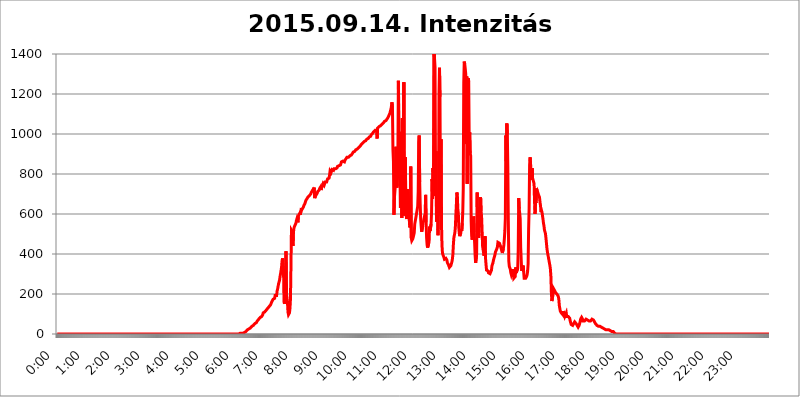
| Category | 2015.09.14. Intenzitás [W/m^2] |
|---|---|
| 0.0 | 0 |
| 0.0006944444444444445 | 0 |
| 0.001388888888888889 | 0 |
| 0.0020833333333333333 | 0 |
| 0.002777777777777778 | 0 |
| 0.003472222222222222 | 0 |
| 0.004166666666666667 | 0 |
| 0.004861111111111111 | 0 |
| 0.005555555555555556 | 0 |
| 0.0062499999999999995 | 0 |
| 0.006944444444444444 | 0 |
| 0.007638888888888889 | 0 |
| 0.008333333333333333 | 0 |
| 0.009027777777777779 | 0 |
| 0.009722222222222222 | 0 |
| 0.010416666666666666 | 0 |
| 0.011111111111111112 | 0 |
| 0.011805555555555555 | 0 |
| 0.012499999999999999 | 0 |
| 0.013194444444444444 | 0 |
| 0.013888888888888888 | 0 |
| 0.014583333333333332 | 0 |
| 0.015277777777777777 | 0 |
| 0.015972222222222224 | 0 |
| 0.016666666666666666 | 0 |
| 0.017361111111111112 | 0 |
| 0.018055555555555557 | 0 |
| 0.01875 | 0 |
| 0.019444444444444445 | 0 |
| 0.02013888888888889 | 0 |
| 0.020833333333333332 | 0 |
| 0.02152777777777778 | 0 |
| 0.022222222222222223 | 0 |
| 0.02291666666666667 | 0 |
| 0.02361111111111111 | 0 |
| 0.024305555555555556 | 0 |
| 0.024999999999999998 | 0 |
| 0.025694444444444447 | 0 |
| 0.02638888888888889 | 0 |
| 0.027083333333333334 | 0 |
| 0.027777777777777776 | 0 |
| 0.02847222222222222 | 0 |
| 0.029166666666666664 | 0 |
| 0.029861111111111113 | 0 |
| 0.030555555555555555 | 0 |
| 0.03125 | 0 |
| 0.03194444444444445 | 0 |
| 0.03263888888888889 | 0 |
| 0.03333333333333333 | 0 |
| 0.034027777777777775 | 0 |
| 0.034722222222222224 | 0 |
| 0.035416666666666666 | 0 |
| 0.036111111111111115 | 0 |
| 0.03680555555555556 | 0 |
| 0.0375 | 0 |
| 0.03819444444444444 | 0 |
| 0.03888888888888889 | 0 |
| 0.03958333333333333 | 0 |
| 0.04027777777777778 | 0 |
| 0.04097222222222222 | 0 |
| 0.041666666666666664 | 0 |
| 0.042361111111111106 | 0 |
| 0.04305555555555556 | 0 |
| 0.043750000000000004 | 0 |
| 0.044444444444444446 | 0 |
| 0.04513888888888889 | 0 |
| 0.04583333333333334 | 0 |
| 0.04652777777777778 | 0 |
| 0.04722222222222222 | 0 |
| 0.04791666666666666 | 0 |
| 0.04861111111111111 | 0 |
| 0.049305555555555554 | 0 |
| 0.049999999999999996 | 0 |
| 0.05069444444444445 | 0 |
| 0.051388888888888894 | 0 |
| 0.052083333333333336 | 0 |
| 0.05277777777777778 | 0 |
| 0.05347222222222222 | 0 |
| 0.05416666666666667 | 0 |
| 0.05486111111111111 | 0 |
| 0.05555555555555555 | 0 |
| 0.05625 | 0 |
| 0.05694444444444444 | 0 |
| 0.057638888888888885 | 0 |
| 0.05833333333333333 | 0 |
| 0.05902777777777778 | 0 |
| 0.059722222222222225 | 0 |
| 0.06041666666666667 | 0 |
| 0.061111111111111116 | 0 |
| 0.06180555555555556 | 0 |
| 0.0625 | 0 |
| 0.06319444444444444 | 0 |
| 0.06388888888888888 | 0 |
| 0.06458333333333334 | 0 |
| 0.06527777777777778 | 0 |
| 0.06597222222222222 | 0 |
| 0.06666666666666667 | 0 |
| 0.06736111111111111 | 0 |
| 0.06805555555555555 | 0 |
| 0.06874999999999999 | 0 |
| 0.06944444444444443 | 0 |
| 0.07013888888888889 | 0 |
| 0.07083333333333333 | 0 |
| 0.07152777777777779 | 0 |
| 0.07222222222222223 | 0 |
| 0.07291666666666667 | 0 |
| 0.07361111111111111 | 0 |
| 0.07430555555555556 | 0 |
| 0.075 | 0 |
| 0.07569444444444444 | 0 |
| 0.0763888888888889 | 0 |
| 0.07708333333333334 | 0 |
| 0.07777777777777778 | 0 |
| 0.07847222222222222 | 0 |
| 0.07916666666666666 | 0 |
| 0.0798611111111111 | 0 |
| 0.08055555555555556 | 0 |
| 0.08125 | 0 |
| 0.08194444444444444 | 0 |
| 0.08263888888888889 | 0 |
| 0.08333333333333333 | 0 |
| 0.08402777777777777 | 0 |
| 0.08472222222222221 | 0 |
| 0.08541666666666665 | 0 |
| 0.08611111111111112 | 0 |
| 0.08680555555555557 | 0 |
| 0.08750000000000001 | 0 |
| 0.08819444444444445 | 0 |
| 0.08888888888888889 | 0 |
| 0.08958333333333333 | 0 |
| 0.09027777777777778 | 0 |
| 0.09097222222222222 | 0 |
| 0.09166666666666667 | 0 |
| 0.09236111111111112 | 0 |
| 0.09305555555555556 | 0 |
| 0.09375 | 0 |
| 0.09444444444444444 | 0 |
| 0.09513888888888888 | 0 |
| 0.09583333333333333 | 0 |
| 0.09652777777777777 | 0 |
| 0.09722222222222222 | 0 |
| 0.09791666666666667 | 0 |
| 0.09861111111111111 | 0 |
| 0.09930555555555555 | 0 |
| 0.09999999999999999 | 0 |
| 0.10069444444444443 | 0 |
| 0.1013888888888889 | 0 |
| 0.10208333333333335 | 0 |
| 0.10277777777777779 | 0 |
| 0.10347222222222223 | 0 |
| 0.10416666666666667 | 0 |
| 0.10486111111111111 | 0 |
| 0.10555555555555556 | 0 |
| 0.10625 | 0 |
| 0.10694444444444444 | 0 |
| 0.1076388888888889 | 0 |
| 0.10833333333333334 | 0 |
| 0.10902777777777778 | 0 |
| 0.10972222222222222 | 0 |
| 0.1111111111111111 | 0 |
| 0.11180555555555556 | 0 |
| 0.11180555555555556 | 0 |
| 0.1125 | 0 |
| 0.11319444444444444 | 0 |
| 0.11388888888888889 | 0 |
| 0.11458333333333333 | 0 |
| 0.11527777777777777 | 0 |
| 0.11597222222222221 | 0 |
| 0.11666666666666665 | 0 |
| 0.1173611111111111 | 0 |
| 0.11805555555555557 | 0 |
| 0.11944444444444445 | 0 |
| 0.12013888888888889 | 0 |
| 0.12083333333333333 | 0 |
| 0.12152777777777778 | 0 |
| 0.12222222222222223 | 0 |
| 0.12291666666666667 | 0 |
| 0.12291666666666667 | 0 |
| 0.12361111111111112 | 0 |
| 0.12430555555555556 | 0 |
| 0.125 | 0 |
| 0.12569444444444444 | 0 |
| 0.12638888888888888 | 0 |
| 0.12708333333333333 | 0 |
| 0.16875 | 0 |
| 0.12847222222222224 | 0 |
| 0.12916666666666668 | 0 |
| 0.12986111111111112 | 0 |
| 0.13055555555555556 | 0 |
| 0.13125 | 0 |
| 0.13194444444444445 | 0 |
| 0.1326388888888889 | 0 |
| 0.13333333333333333 | 0 |
| 0.13402777777777777 | 0 |
| 0.13402777777777777 | 0 |
| 0.13472222222222222 | 0 |
| 0.13541666666666666 | 0 |
| 0.1361111111111111 | 0 |
| 0.13749999999999998 | 0 |
| 0.13819444444444443 | 0 |
| 0.1388888888888889 | 0 |
| 0.13958333333333334 | 0 |
| 0.14027777777777778 | 0 |
| 0.14097222222222222 | 0 |
| 0.14166666666666666 | 0 |
| 0.1423611111111111 | 0 |
| 0.14305555555555557 | 0 |
| 0.14375000000000002 | 0 |
| 0.14444444444444446 | 0 |
| 0.1451388888888889 | 0 |
| 0.1451388888888889 | 0 |
| 0.14652777777777778 | 0 |
| 0.14722222222222223 | 0 |
| 0.14791666666666667 | 0 |
| 0.1486111111111111 | 0 |
| 0.14930555555555555 | 0 |
| 0.15 | 0 |
| 0.15069444444444444 | 0 |
| 0.15138888888888888 | 0 |
| 0.15208333333333332 | 0 |
| 0.15277777777777776 | 0 |
| 0.15347222222222223 | 0 |
| 0.15416666666666667 | 0 |
| 0.15486111111111112 | 0 |
| 0.15555555555555556 | 0 |
| 0.15625 | 0 |
| 0.15694444444444444 | 0 |
| 0.15763888888888888 | 0 |
| 0.15833333333333333 | 0 |
| 0.15902777777777777 | 0 |
| 0.15972222222222224 | 0 |
| 0.16041666666666668 | 0 |
| 0.16111111111111112 | 0 |
| 0.16180555555555556 | 0 |
| 0.1625 | 0 |
| 0.16319444444444445 | 0 |
| 0.1638888888888889 | 0 |
| 0.16458333333333333 | 0 |
| 0.16527777777777777 | 0 |
| 0.16597222222222222 | 0 |
| 0.16666666666666666 | 0 |
| 0.1673611111111111 | 0 |
| 0.16805555555555554 | 0 |
| 0.16874999999999998 | 0 |
| 0.16944444444444443 | 0 |
| 0.17013888888888887 | 0 |
| 0.1708333333333333 | 0 |
| 0.17152777777777775 | 0 |
| 0.17222222222222225 | 0 |
| 0.1729166666666667 | 0 |
| 0.17361111111111113 | 0 |
| 0.17430555555555557 | 0 |
| 0.17500000000000002 | 0 |
| 0.17569444444444446 | 0 |
| 0.1763888888888889 | 0 |
| 0.17708333333333334 | 0 |
| 0.17777777777777778 | 0 |
| 0.17847222222222223 | 0 |
| 0.17916666666666667 | 0 |
| 0.1798611111111111 | 0 |
| 0.18055555555555555 | 0 |
| 0.18125 | 0 |
| 0.18194444444444444 | 0 |
| 0.1826388888888889 | 0 |
| 0.18333333333333335 | 0 |
| 0.1840277777777778 | 0 |
| 0.18472222222222223 | 0 |
| 0.18541666666666667 | 0 |
| 0.18611111111111112 | 0 |
| 0.18680555555555556 | 0 |
| 0.1875 | 0 |
| 0.18819444444444444 | 0 |
| 0.18888888888888888 | 0 |
| 0.18958333333333333 | 0 |
| 0.19027777777777777 | 0 |
| 0.1909722222222222 | 0 |
| 0.19166666666666665 | 0 |
| 0.19236111111111112 | 0 |
| 0.19305555555555554 | 0 |
| 0.19375 | 0 |
| 0.19444444444444445 | 0 |
| 0.1951388888888889 | 0 |
| 0.19583333333333333 | 0 |
| 0.19652777777777777 | 0 |
| 0.19722222222222222 | 0 |
| 0.19791666666666666 | 0 |
| 0.1986111111111111 | 0 |
| 0.19930555555555554 | 0 |
| 0.19999999999999998 | 0 |
| 0.20069444444444443 | 0 |
| 0.20138888888888887 | 0 |
| 0.2020833333333333 | 0 |
| 0.2027777777777778 | 0 |
| 0.2034722222222222 | 0 |
| 0.2041666666666667 | 0 |
| 0.20486111111111113 | 0 |
| 0.20555555555555557 | 0 |
| 0.20625000000000002 | 0 |
| 0.20694444444444446 | 0 |
| 0.2076388888888889 | 0 |
| 0.20833333333333334 | 0 |
| 0.20902777777777778 | 0 |
| 0.20972222222222223 | 0 |
| 0.21041666666666667 | 0 |
| 0.2111111111111111 | 0 |
| 0.21180555555555555 | 0 |
| 0.2125 | 0 |
| 0.21319444444444444 | 0 |
| 0.2138888888888889 | 0 |
| 0.21458333333333335 | 0 |
| 0.2152777777777778 | 0 |
| 0.21597222222222223 | 0 |
| 0.21666666666666667 | 0 |
| 0.21736111111111112 | 0 |
| 0.21805555555555556 | 0 |
| 0.21875 | 0 |
| 0.21944444444444444 | 0 |
| 0.22013888888888888 | 0 |
| 0.22083333333333333 | 0 |
| 0.22152777777777777 | 0 |
| 0.2222222222222222 | 0 |
| 0.22291666666666665 | 0 |
| 0.2236111111111111 | 0 |
| 0.22430555555555556 | 0 |
| 0.225 | 0 |
| 0.22569444444444445 | 0 |
| 0.2263888888888889 | 0 |
| 0.22708333333333333 | 0 |
| 0.22777777777777777 | 0 |
| 0.22847222222222222 | 0 |
| 0.22916666666666666 | 0 |
| 0.2298611111111111 | 0 |
| 0.23055555555555554 | 0 |
| 0.23124999999999998 | 0 |
| 0.23194444444444443 | 0 |
| 0.23263888888888887 | 0 |
| 0.2333333333333333 | 0 |
| 0.2340277777777778 | 0 |
| 0.2347222222222222 | 0 |
| 0.2354166666666667 | 0 |
| 0.23611111111111113 | 0 |
| 0.23680555555555557 | 0 |
| 0.23750000000000002 | 0 |
| 0.23819444444444446 | 0 |
| 0.2388888888888889 | 0 |
| 0.23958333333333334 | 0 |
| 0.24027777777777778 | 0 |
| 0.24097222222222223 | 0 |
| 0.24166666666666667 | 0 |
| 0.2423611111111111 | 0 |
| 0.24305555555555555 | 0 |
| 0.24375 | 0 |
| 0.24444444444444446 | 0 |
| 0.24513888888888888 | 0 |
| 0.24583333333333335 | 0 |
| 0.2465277777777778 | 0 |
| 0.24722222222222223 | 0 |
| 0.24791666666666667 | 0 |
| 0.24861111111111112 | 0 |
| 0.24930555555555556 | 0 |
| 0.25 | 0 |
| 0.25069444444444444 | 0 |
| 0.2513888888888889 | 0 |
| 0.2520833333333333 | 0 |
| 0.25277777777777777 | 0 |
| 0.2534722222222222 | 0 |
| 0.25416666666666665 | 0 |
| 0.2548611111111111 | 3.525 |
| 0.2555555555555556 | 3.525 |
| 0.25625000000000003 | 3.525 |
| 0.2569444444444445 | 3.525 |
| 0.2576388888888889 | 3.525 |
| 0.25833333333333336 | 3.525 |
| 0.2590277777777778 | 3.525 |
| 0.25972222222222224 | 3.525 |
| 0.2604166666666667 | 3.525 |
| 0.2611111111111111 | 7.887 |
| 0.26180555555555557 | 7.887 |
| 0.2625 | 7.887 |
| 0.26319444444444445 | 7.887 |
| 0.2638888888888889 | 12.257 |
| 0.26458333333333334 | 12.257 |
| 0.2652777777777778 | 16.636 |
| 0.2659722222222222 | 16.636 |
| 0.26666666666666666 | 21.024 |
| 0.2673611111111111 | 21.024 |
| 0.26805555555555555 | 25.419 |
| 0.26875 | 25.419 |
| 0.26944444444444443 | 29.823 |
| 0.2701388888888889 | 29.823 |
| 0.2708333333333333 | 29.823 |
| 0.27152777777777776 | 34.234 |
| 0.2722222222222222 | 34.234 |
| 0.27291666666666664 | 38.653 |
| 0.2736111111111111 | 38.653 |
| 0.2743055555555555 | 43.079 |
| 0.27499999999999997 | 43.079 |
| 0.27569444444444446 | 47.511 |
| 0.27638888888888885 | 47.511 |
| 0.27708333333333335 | 51.951 |
| 0.2777777777777778 | 51.951 |
| 0.27847222222222223 | 56.398 |
| 0.2791666666666667 | 56.398 |
| 0.2798611111111111 | 60.85 |
| 0.28055555555555556 | 65.31 |
| 0.28125 | 65.31 |
| 0.28194444444444444 | 69.775 |
| 0.2826388888888889 | 74.246 |
| 0.2833333333333333 | 74.246 |
| 0.28402777777777777 | 78.722 |
| 0.2847222222222222 | 83.205 |
| 0.28541666666666665 | 83.205 |
| 0.28611111111111115 | 83.205 |
| 0.28680555555555554 | 87.692 |
| 0.28750000000000003 | 92.184 |
| 0.2881944444444445 | 96.682 |
| 0.2888888888888889 | 105.69 |
| 0.28958333333333336 | 105.69 |
| 0.2902777777777778 | 101.184 |
| 0.29097222222222224 | 110.201 |
| 0.2916666666666667 | 114.716 |
| 0.2923611111111111 | 114.716 |
| 0.29305555555555557 | 119.235 |
| 0.29375 | 123.758 |
| 0.29444444444444445 | 123.758 |
| 0.2951388888888889 | 128.284 |
| 0.29583333333333334 | 132.814 |
| 0.2965277777777778 | 132.814 |
| 0.2972222222222222 | 137.347 |
| 0.29791666666666666 | 141.884 |
| 0.2986111111111111 | 141.884 |
| 0.29930555555555555 | 146.423 |
| 0.3 | 146.423 |
| 0.30069444444444443 | 160.056 |
| 0.3013888888888889 | 160.056 |
| 0.3020833333333333 | 164.605 |
| 0.30277777777777776 | 173.709 |
| 0.3034722222222222 | 173.709 |
| 0.30416666666666664 | 173.709 |
| 0.3048611111111111 | 178.264 |
| 0.3055555555555555 | 191.937 |
| 0.30624999999999997 | 196.497 |
| 0.3069444444444444 | 196.497 |
| 0.3076388888888889 | 191.937 |
| 0.30833333333333335 | 214.746 |
| 0.3090277777777778 | 223.873 |
| 0.30972222222222223 | 223.873 |
| 0.3104166666666667 | 251.251 |
| 0.3111111111111111 | 260.373 |
| 0.31180555555555556 | 269.49 |
| 0.3125 | 287.709 |
| 0.31319444444444444 | 301.354 |
| 0.3138888888888889 | 296.808 |
| 0.3145833333333333 | 333.113 |
| 0.31527777777777777 | 364.728 |
| 0.3159722222222222 | 378.224 |
| 0.31666666666666665 | 382.715 |
| 0.31736111111111115 | 314.98 |
| 0.31805555555555554 | 160.056 |
| 0.31875000000000003 | 150.964 |
| 0.3194444444444445 | 146.423 |
| 0.3201388888888889 | 219.309 |
| 0.32083333333333336 | 414.035 |
| 0.3215277777777778 | 196.497 |
| 0.32222222222222224 | 182.82 |
| 0.3229166666666667 | 155.509 |
| 0.3236111111111111 | 110.201 |
| 0.32430555555555557 | 96.682 |
| 0.325 | 96.682 |
| 0.32569444444444445 | 105.69 |
| 0.3263888888888889 | 128.284 |
| 0.32708333333333334 | 173.709 |
| 0.3277777777777778 | 337.639 |
| 0.3284722222222222 | 519.555 |
| 0.32916666666666666 | 519.555 |
| 0.3298611111111111 | 510.885 |
| 0.33055555555555555 | 440.702 |
| 0.33125 | 506.542 |
| 0.33194444444444443 | 528.2 |
| 0.3326388888888889 | 536.82 |
| 0.3333333333333333 | 532.513 |
| 0.3340277777777778 | 541.121 |
| 0.3347222222222222 | 553.986 |
| 0.3354166666666667 | 566.793 |
| 0.3361111111111111 | 575.299 |
| 0.3368055555555556 | 566.793 |
| 0.33749999999999997 | 558.261 |
| 0.33819444444444446 | 588.009 |
| 0.33888888888888885 | 596.45 |
| 0.33958333333333335 | 600.661 |
| 0.34027777777777773 | 604.864 |
| 0.34097222222222223 | 596.45 |
| 0.3416666666666666 | 613.252 |
| 0.3423611111111111 | 629.948 |
| 0.3430555555555555 | 621.613 |
| 0.34375 | 617.436 |
| 0.3444444444444445 | 625.784 |
| 0.3451388888888889 | 634.105 |
| 0.3458333333333334 | 642.4 |
| 0.34652777777777777 | 646.537 |
| 0.34722222222222227 | 650.667 |
| 0.34791666666666665 | 654.791 |
| 0.34861111111111115 | 667.123 |
| 0.34930555555555554 | 667.123 |
| 0.35000000000000003 | 675.311 |
| 0.3506944444444444 | 675.311 |
| 0.3513888888888889 | 683.473 |
| 0.3520833333333333 | 683.473 |
| 0.3527777777777778 | 687.544 |
| 0.3534722222222222 | 691.608 |
| 0.3541666666666667 | 695.666 |
| 0.3548611111111111 | 695.666 |
| 0.35555555555555557 | 699.717 |
| 0.35625 | 707.8 |
| 0.35694444444444445 | 711.832 |
| 0.3576388888888889 | 711.832 |
| 0.35833333333333334 | 719.877 |
| 0.3590277777777778 | 711.832 |
| 0.3597222222222222 | 723.889 |
| 0.36041666666666666 | 731.896 |
| 0.3611111111111111 | 679.395 |
| 0.36180555555555555 | 687.544 |
| 0.3625 | 691.608 |
| 0.36319444444444443 | 695.666 |
| 0.3638888888888889 | 699.717 |
| 0.3645833333333333 | 703.762 |
| 0.3652777777777778 | 711.832 |
| 0.3659722222222222 | 711.832 |
| 0.3666666666666667 | 715.858 |
| 0.3673611111111111 | 719.877 |
| 0.3680555555555556 | 727.896 |
| 0.36874999999999997 | 727.896 |
| 0.36944444444444446 | 735.89 |
| 0.37013888888888885 | 719.877 |
| 0.37083333333333335 | 731.896 |
| 0.37152777777777773 | 731.896 |
| 0.37222222222222223 | 743.859 |
| 0.3729166666666666 | 751.803 |
| 0.3736111111111111 | 747.834 |
| 0.3743055555555555 | 743.859 |
| 0.375 | 751.803 |
| 0.3756944444444445 | 759.723 |
| 0.3763888888888889 | 759.723 |
| 0.3770833333333334 | 763.674 |
| 0.37777777777777777 | 759.723 |
| 0.37847222222222227 | 767.62 |
| 0.37916666666666665 | 775.492 |
| 0.37986111111111115 | 779.42 |
| 0.38055555555555554 | 771.559 |
| 0.38125000000000003 | 779.42 |
| 0.3819444444444444 | 795.074 |
| 0.3826388888888889 | 814.519 |
| 0.3833333333333333 | 810.641 |
| 0.3840277777777778 | 806.757 |
| 0.3847222222222222 | 810.641 |
| 0.3854166666666667 | 822.26 |
| 0.3861111111111111 | 818.392 |
| 0.38680555555555557 | 818.392 |
| 0.3875 | 818.392 |
| 0.38819444444444445 | 826.123 |
| 0.3888888888888889 | 822.26 |
| 0.38958333333333334 | 826.123 |
| 0.3902777777777778 | 826.123 |
| 0.3909722222222222 | 829.981 |
| 0.39166666666666666 | 829.981 |
| 0.3923611111111111 | 829.981 |
| 0.39305555555555555 | 837.682 |
| 0.39375 | 841.526 |
| 0.39444444444444443 | 841.526 |
| 0.3951388888888889 | 841.526 |
| 0.3958333333333333 | 845.365 |
| 0.3965277777777778 | 845.365 |
| 0.3972222222222222 | 845.365 |
| 0.3979166666666667 | 853.029 |
| 0.3986111111111111 | 860.676 |
| 0.3993055555555556 | 860.676 |
| 0.39999999999999997 | 860.676 |
| 0.40069444444444446 | 864.493 |
| 0.40138888888888885 | 868.305 |
| 0.40208333333333335 | 860.676 |
| 0.40277777777777773 | 860.676 |
| 0.40347222222222223 | 868.305 |
| 0.4041666666666666 | 872.114 |
| 0.4048611111111111 | 875.918 |
| 0.4055555555555555 | 879.719 |
| 0.40625 | 883.516 |
| 0.4069444444444445 | 883.516 |
| 0.4076388888888889 | 883.516 |
| 0.4083333333333334 | 883.516 |
| 0.40902777777777777 | 887.309 |
| 0.40972222222222227 | 887.309 |
| 0.41041666666666665 | 891.099 |
| 0.41111111111111115 | 894.885 |
| 0.41180555555555554 | 894.885 |
| 0.41250000000000003 | 894.885 |
| 0.4131944444444444 | 898.668 |
| 0.4138888888888889 | 902.447 |
| 0.4145833333333333 | 906.223 |
| 0.4152777777777778 | 909.996 |
| 0.4159722222222222 | 906.223 |
| 0.4166666666666667 | 909.996 |
| 0.4173611111111111 | 913.766 |
| 0.41805555555555557 | 917.534 |
| 0.41875 | 921.298 |
| 0.41944444444444445 | 921.298 |
| 0.4201388888888889 | 925.06 |
| 0.42083333333333334 | 925.06 |
| 0.4215277777777778 | 928.819 |
| 0.4222222222222222 | 928.819 |
| 0.42291666666666666 | 932.576 |
| 0.4236111111111111 | 932.576 |
| 0.42430555555555555 | 936.33 |
| 0.425 | 940.082 |
| 0.42569444444444443 | 943.832 |
| 0.4263888888888889 | 947.58 |
| 0.4270833333333333 | 947.58 |
| 0.4277777777777778 | 951.327 |
| 0.4284722222222222 | 955.071 |
| 0.4291666666666667 | 958.814 |
| 0.4298611111111111 | 958.814 |
| 0.4305555555555556 | 962.555 |
| 0.43124999999999997 | 962.555 |
| 0.43194444444444446 | 966.295 |
| 0.43263888888888885 | 966.295 |
| 0.43333333333333335 | 970.034 |
| 0.43402777777777773 | 973.772 |
| 0.43472222222222223 | 973.772 |
| 0.4354166666666666 | 973.772 |
| 0.4361111111111111 | 977.508 |
| 0.4368055555555555 | 977.508 |
| 0.4375 | 984.98 |
| 0.4381944444444445 | 988.714 |
| 0.4388888888888889 | 988.714 |
| 0.4395833333333334 | 988.714 |
| 0.44027777777777777 | 996.182 |
| 0.44097222222222227 | 996.182 |
| 0.44166666666666665 | 996.182 |
| 0.44236111111111115 | 1003.65 |
| 0.44305555555555554 | 1007.383 |
| 0.44375000000000003 | 1011.118 |
| 0.4444444444444444 | 1011.118 |
| 0.4451388888888889 | 1014.852 |
| 0.4458333333333333 | 1018.587 |
| 0.4465277777777778 | 1018.587 |
| 0.4472222222222222 | 1022.323 |
| 0.4479166666666667 | 1014.852 |
| 0.4486111111111111 | 977.508 |
| 0.44930555555555557 | 1029.798 |
| 0.45 | 1029.798 |
| 0.45069444444444445 | 1033.537 |
| 0.4513888888888889 | 1037.277 |
| 0.45208333333333334 | 1037.277 |
| 0.4527777777777778 | 1037.277 |
| 0.4534722222222222 | 1041.019 |
| 0.45416666666666666 | 1044.762 |
| 0.4548611111111111 | 1044.762 |
| 0.45555555555555555 | 1048.508 |
| 0.45625 | 1048.508 |
| 0.45694444444444443 | 1052.255 |
| 0.4576388888888889 | 1056.004 |
| 0.4583333333333333 | 1059.756 |
| 0.4590277777777778 | 1063.51 |
| 0.4597222222222222 | 1067.267 |
| 0.4604166666666667 | 1067.267 |
| 0.4611111111111111 | 1067.267 |
| 0.4618055555555556 | 1071.027 |
| 0.46249999999999997 | 1074.789 |
| 0.46319444444444446 | 1078.555 |
| 0.46388888888888885 | 1082.324 |
| 0.46458333333333335 | 1086.097 |
| 0.46527777777777773 | 1093.653 |
| 0.46597222222222223 | 1097.437 |
| 0.4666666666666666 | 1105.019 |
| 0.4673611111111111 | 1116.426 |
| 0.4680555555555555 | 1124.056 |
| 0.46875 | 1139.384 |
| 0.4694444444444445 | 1158.689 |
| 0.4701388888888889 | 1131.708 |
| 0.4708333333333334 | 921.298 |
| 0.47152777777777777 | 864.493 |
| 0.47222222222222227 | 596.45 |
| 0.47291666666666665 | 683.473 |
| 0.47361111111111115 | 679.395 |
| 0.47430555555555554 | 747.834 |
| 0.47500000000000003 | 936.33 |
| 0.4756944444444444 | 775.492 |
| 0.4763888888888889 | 731.896 |
| 0.4770833333333333 | 751.803 |
| 0.4777777777777778 | 909.996 |
| 0.4784722222222222 | 1266.8 |
| 0.4791666666666667 | 992.448 |
| 0.4798611111111111 | 1011.118 |
| 0.48055555555555557 | 856.855 |
| 0.48125 | 629.948 |
| 0.48194444444444445 | 731.896 |
| 0.4826388888888889 | 703.762 |
| 0.48333333333333334 | 579.542 |
| 0.4840277777777778 | 1078.555 |
| 0.4847222222222222 | 755.766 |
| 0.48541666666666666 | 600.661 |
| 0.4861111111111111 | 1258.511 |
| 0.48680555555555555 | 592.233 |
| 0.4875 | 596.45 |
| 0.48819444444444443 | 883.516 |
| 0.4888888888888889 | 609.062 |
| 0.4895833333333333 | 588.009 |
| 0.4902777777777778 | 575.299 |
| 0.4909722222222222 | 723.889 |
| 0.4916666666666667 | 646.537 |
| 0.4923611111111111 | 617.436 |
| 0.4930555555555556 | 579.542 |
| 0.49374999999999997 | 571.049 |
| 0.49444444444444446 | 532.513 |
| 0.49513888888888885 | 545.416 |
| 0.49583333333333335 | 837.682 |
| 0.49652777777777773 | 480.356 |
| 0.49722222222222223 | 467.187 |
| 0.4979166666666666 | 467.187 |
| 0.4986111111111111 | 475.972 |
| 0.4993055555555555 | 484.735 |
| 0.5 | 489.108 |
| 0.5006944444444444 | 506.542 |
| 0.5013888888888889 | 549.704 |
| 0.5020833333333333 | 545.416 |
| 0.5027777777777778 | 549.704 |
| 0.5034722222222222 | 592.233 |
| 0.5041666666666667 | 592.233 |
| 0.5048611111111111 | 592.233 |
| 0.5055555555555555 | 638.256 |
| 0.50625 | 711.832 |
| 0.5069444444444444 | 958.814 |
| 0.5076388888888889 | 992.448 |
| 0.5083333333333333 | 759.723 |
| 0.5090277777777777 | 650.667 |
| 0.5097222222222222 | 575.299 |
| 0.5104166666666666 | 541.121 |
| 0.5111111111111112 | 510.885 |
| 0.5118055555555555 | 506.542 |
| 0.5125000000000001 | 536.82 |
| 0.5131944444444444 | 558.261 |
| 0.513888888888889 | 566.793 |
| 0.5145833333333333 | 566.793 |
| 0.5152777777777778 | 592.233 |
| 0.5159722222222222 | 600.661 |
| 0.5166666666666667 | 695.666 |
| 0.517361111111111 | 558.261 |
| 0.5180555555555556 | 480.356 |
| 0.5187499999999999 | 445.129 |
| 0.5194444444444445 | 431.833 |
| 0.5201388888888888 | 431.833 |
| 0.5208333333333334 | 449.551 |
| 0.5215277777777778 | 462.786 |
| 0.5222222222222223 | 536.82 |
| 0.5229166666666667 | 515.223 |
| 0.5236111111111111 | 510.885 |
| 0.5243055555555556 | 549.704 |
| 0.525 | 609.062 |
| 0.5256944444444445 | 775.492 |
| 0.5263888888888889 | 675.311 |
| 0.5270833333333333 | 829.981 |
| 0.5277777777777778 | 691.608 |
| 0.5284722222222222 | 1403.469 |
| 0.5291666666666667 | 1375.633 |
| 0.5298611111111111 | 1335.223 |
| 0.5305555555555556 | 775.492 |
| 0.53125 | 913.766 |
| 0.5319444444444444 | 562.53 |
| 0.5326388888888889 | 634.105 |
| 0.5333333333333333 | 592.233 |
| 0.5340277777777778 | 493.475 |
| 0.5347222222222222 | 625.784 |
| 0.5354166666666667 | 1197.876 |
| 0.5361111111111111 | 1330.826 |
| 0.5368055555555555 | 1186.03 |
| 0.5375 | 629.948 |
| 0.5381944444444444 | 973.772 |
| 0.5388888888888889 | 553.986 |
| 0.5395833333333333 | 445.129 |
| 0.5402777777777777 | 405.108 |
| 0.5409722222222222 | 396.164 |
| 0.5416666666666666 | 391.685 |
| 0.5423611111111112 | 382.715 |
| 0.5430555555555555 | 373.729 |
| 0.5437500000000001 | 369.23 |
| 0.5444444444444444 | 378.224 |
| 0.545138888888889 | 378.224 |
| 0.5458333333333333 | 373.729 |
| 0.5465277777777778 | 369.23 |
| 0.5472222222222222 | 355.712 |
| 0.5479166666666667 | 351.198 |
| 0.548611111111111 | 346.682 |
| 0.5493055555555556 | 342.162 |
| 0.5499999999999999 | 333.113 |
| 0.5506944444444445 | 333.113 |
| 0.5513888888888888 | 337.639 |
| 0.5520833333333334 | 342.162 |
| 0.5527777777777778 | 351.198 |
| 0.5534722222222223 | 360.221 |
| 0.5541666666666667 | 373.729 |
| 0.5548611111111111 | 396.164 |
| 0.5555555555555556 | 445.129 |
| 0.55625 | 480.356 |
| 0.5569444444444445 | 493.475 |
| 0.5576388888888889 | 506.542 |
| 0.5583333333333333 | 532.513 |
| 0.5590277777777778 | 592.233 |
| 0.5597222222222222 | 642.4 |
| 0.5604166666666667 | 707.8 |
| 0.5611111111111111 | 695.666 |
| 0.5618055555555556 | 625.784 |
| 0.5625 | 604.864 |
| 0.5631944444444444 | 532.513 |
| 0.5638888888888889 | 502.192 |
| 0.5645833333333333 | 489.108 |
| 0.5652777777777778 | 493.475 |
| 0.5659722222222222 | 506.542 |
| 0.5666666666666667 | 523.88 |
| 0.5673611111111111 | 515.223 |
| 0.5680555555555555 | 553.986 |
| 0.56875 | 609.062 |
| 0.5694444444444444 | 727.896 |
| 0.5701388888888889 | 1254.387 |
| 0.5708333333333333 | 1361.991 |
| 0.5715277777777777 | 1348.524 |
| 0.5722222222222222 | 1326.445 |
| 0.5729166666666666 | 1300.514 |
| 0.5736111111111112 | 951.327 |
| 0.5743055555555555 | 1287.761 |
| 0.5750000000000001 | 751.803 |
| 0.5756944444444444 | 1093.653 |
| 0.576388888888889 | 1279.334 |
| 0.5770833333333333 | 1262.649 |
| 0.5777777777777778 | 970.034 |
| 0.5784722222222222 | 1007.383 |
| 0.5791666666666667 | 902.447 |
| 0.579861111111111 | 891.099 |
| 0.5805555555555556 | 562.53 |
| 0.5812499999999999 | 489.108 |
| 0.5819444444444445 | 471.582 |
| 0.5826388888888888 | 489.108 |
| 0.5833333333333334 | 506.542 |
| 0.5840277777777778 | 588.009 |
| 0.5847222222222223 | 510.885 |
| 0.5854166666666667 | 453.968 |
| 0.5861111111111111 | 391.685 |
| 0.5868055555555556 | 355.712 |
| 0.5875 | 360.221 |
| 0.5881944444444445 | 396.164 |
| 0.5888888888888889 | 707.8 |
| 0.5895833333333333 | 566.793 |
| 0.5902777777777778 | 558.261 |
| 0.5909722222222222 | 480.356 |
| 0.5916666666666667 | 502.192 |
| 0.5923611111111111 | 558.261 |
| 0.5930555555555556 | 604.864 |
| 0.59375 | 683.473 |
| 0.5944444444444444 | 613.252 |
| 0.5951388888888889 | 588.009 |
| 0.5958333333333333 | 519.555 |
| 0.5965277777777778 | 440.702 |
| 0.5972222222222222 | 422.943 |
| 0.5979166666666667 | 427.39 |
| 0.5986111111111111 | 391.685 |
| 0.5993055555555555 | 391.685 |
| 0.6 | 489.108 |
| 0.6006944444444444 | 378.224 |
| 0.6013888888888889 | 346.682 |
| 0.6020833333333333 | 319.517 |
| 0.6027777777777777 | 314.98 |
| 0.6034722222222222 | 314.98 |
| 0.6041666666666666 | 314.98 |
| 0.6048611111111112 | 305.898 |
| 0.6055555555555555 | 301.354 |
| 0.6062500000000001 | 301.354 |
| 0.6069444444444444 | 301.354 |
| 0.607638888888889 | 305.898 |
| 0.6083333333333333 | 305.898 |
| 0.6090277777777778 | 319.517 |
| 0.6097222222222222 | 342.162 |
| 0.6104166666666667 | 346.682 |
| 0.611111111111111 | 355.712 |
| 0.6118055555555556 | 369.23 |
| 0.6124999999999999 | 378.224 |
| 0.6131944444444445 | 387.202 |
| 0.6138888888888888 | 396.164 |
| 0.6145833333333334 | 409.574 |
| 0.6152777777777778 | 409.574 |
| 0.6159722222222223 | 414.035 |
| 0.6166666666666667 | 427.39 |
| 0.6173611111111111 | 436.27 |
| 0.6180555555555556 | 458.38 |
| 0.61875 | 458.38 |
| 0.6194444444444445 | 458.38 |
| 0.6201388888888889 | 453.968 |
| 0.6208333333333333 | 449.551 |
| 0.6215277777777778 | 440.702 |
| 0.6222222222222222 | 431.833 |
| 0.6229166666666667 | 422.943 |
| 0.6236111111111111 | 414.035 |
| 0.6243055555555556 | 405.108 |
| 0.625 | 409.574 |
| 0.6256944444444444 | 427.39 |
| 0.6263888888888889 | 445.129 |
| 0.6270833333333333 | 475.972 |
| 0.6277777777777778 | 515.223 |
| 0.6284722222222222 | 579.542 |
| 0.6291666666666667 | 992.448 |
| 0.6298611111111111 | 864.493 |
| 0.6305555555555555 | 1052.255 |
| 0.63125 | 999.916 |
| 0.6319444444444444 | 837.682 |
| 0.6326388888888889 | 566.793 |
| 0.6333333333333333 | 364.728 |
| 0.6340277777777777 | 337.639 |
| 0.6347222222222222 | 333.113 |
| 0.6354166666666666 | 324.052 |
| 0.6361111111111112 | 305.898 |
| 0.6368055555555555 | 296.808 |
| 0.6375000000000001 | 292.259 |
| 0.6381944444444444 | 296.808 |
| 0.638888888888889 | 324.052 |
| 0.6395833333333333 | 301.354 |
| 0.6402777777777778 | 278.603 |
| 0.6409722222222222 | 274.047 |
| 0.6416666666666667 | 274.047 |
| 0.642361111111111 | 287.709 |
| 0.6430555555555556 | 333.113 |
| 0.6437499999999999 | 305.898 |
| 0.6444444444444445 | 301.354 |
| 0.6451388888888888 | 310.44 |
| 0.6458333333333334 | 328.584 |
| 0.6465277777777778 | 418.492 |
| 0.6472222222222223 | 679.395 |
| 0.6479166666666667 | 625.784 |
| 0.6486111111111111 | 604.864 |
| 0.6493055555555556 | 575.299 |
| 0.65 | 431.833 |
| 0.6506944444444445 | 431.833 |
| 0.6513888888888889 | 314.98 |
| 0.6520833333333333 | 319.517 |
| 0.6527777777777778 | 310.44 |
| 0.6534722222222222 | 342.162 |
| 0.6541666666666667 | 310.44 |
| 0.6548611111111111 | 278.603 |
| 0.6555555555555556 | 274.047 |
| 0.65625 | 274.047 |
| 0.6569444444444444 | 278.603 |
| 0.6576388888888889 | 278.603 |
| 0.6583333333333333 | 287.709 |
| 0.6590277777777778 | 296.808 |
| 0.6597222222222222 | 314.98 |
| 0.6604166666666667 | 351.198 |
| 0.6611111111111111 | 523.88 |
| 0.6618055555555555 | 625.784 |
| 0.6625 | 845.365 |
| 0.6631944444444444 | 883.516 |
| 0.6638888888888889 | 849.199 |
| 0.6645833333333333 | 853.029 |
| 0.6652777777777777 | 771.559 |
| 0.6659722222222222 | 829.981 |
| 0.6666666666666666 | 779.42 |
| 0.6673611111111111 | 779.42 |
| 0.6680555555555556 | 775.492 |
| 0.6687500000000001 | 751.803 |
| 0.6694444444444444 | 658.909 |
| 0.6701388888888888 | 600.661 |
| 0.6708333333333334 | 663.019 |
| 0.6715277777777778 | 654.791 |
| 0.6722222222222222 | 727.896 |
| 0.6729166666666666 | 703.762 |
| 0.6736111111111112 | 711.832 |
| 0.6743055555555556 | 711.832 |
| 0.6749999999999999 | 695.666 |
| 0.6756944444444444 | 695.666 |
| 0.6763888888888889 | 683.473 |
| 0.6770833333333334 | 658.909 |
| 0.6777777777777777 | 642.4 |
| 0.6784722222222223 | 609.062 |
| 0.6791666666666667 | 617.436 |
| 0.6798611111111111 | 609.062 |
| 0.6805555555555555 | 592.233 |
| 0.68125 | 575.299 |
| 0.6819444444444445 | 553.986 |
| 0.6826388888888889 | 541.121 |
| 0.6833333333333332 | 519.555 |
| 0.6840277777777778 | 510.885 |
| 0.6847222222222222 | 502.192 |
| 0.6854166666666667 | 480.356 |
| 0.686111111111111 | 453.968 |
| 0.6868055555555556 | 427.39 |
| 0.6875 | 409.574 |
| 0.6881944444444444 | 396.164 |
| 0.688888888888889 | 382.715 |
| 0.6895833333333333 | 369.23 |
| 0.6902777777777778 | 355.712 |
| 0.6909722222222222 | 342.162 |
| 0.6916666666666668 | 324.052 |
| 0.6923611111111111 | 287.709 |
| 0.6930555555555555 | 205.62 |
| 0.69375 | 164.605 |
| 0.6944444444444445 | 169.156 |
| 0.6951388888888889 | 196.497 |
| 0.6958333333333333 | 228.436 |
| 0.6965277777777777 | 228.436 |
| 0.6972222222222223 | 223.873 |
| 0.6979166666666666 | 214.746 |
| 0.6986111111111111 | 210.182 |
| 0.6993055555555556 | 205.62 |
| 0.7000000000000001 | 201.058 |
| 0.7006944444444444 | 201.058 |
| 0.7013888888888888 | 196.497 |
| 0.7020833333333334 | 191.937 |
| 0.7027777777777778 | 187.378 |
| 0.7034722222222222 | 173.709 |
| 0.7041666666666666 | 141.884 |
| 0.7048611111111112 | 128.284 |
| 0.7055555555555556 | 114.716 |
| 0.7062499999999999 | 110.201 |
| 0.7069444444444444 | 105.69 |
| 0.7076388888888889 | 101.184 |
| 0.7083333333333334 | 105.69 |
| 0.7090277777777777 | 96.682 |
| 0.7097222222222223 | 114.716 |
| 0.7104166666666667 | 105.69 |
| 0.7111111111111111 | 101.184 |
| 0.7118055555555555 | 87.692 |
| 0.7125 | 87.692 |
| 0.7131944444444445 | 83.205 |
| 0.7138888888888889 | 105.69 |
| 0.7145833333333332 | 87.692 |
| 0.7152777777777778 | 83.205 |
| 0.7159722222222222 | 87.692 |
| 0.7166666666666667 | 87.692 |
| 0.717361111111111 | 87.692 |
| 0.7180555555555556 | 83.205 |
| 0.71875 | 78.722 |
| 0.7194444444444444 | 65.31 |
| 0.720138888888889 | 56.398 |
| 0.7208333333333333 | 47.511 |
| 0.7215277777777778 | 43.079 |
| 0.7222222222222222 | 43.079 |
| 0.7229166666666668 | 43.079 |
| 0.7236111111111111 | 47.511 |
| 0.7243055555555555 | 51.951 |
| 0.725 | 56.398 |
| 0.7256944444444445 | 60.85 |
| 0.7263888888888889 | 60.85 |
| 0.7270833333333333 | 60.85 |
| 0.7277777777777777 | 51.951 |
| 0.7284722222222223 | 47.511 |
| 0.7291666666666666 | 43.079 |
| 0.7298611111111111 | 38.653 |
| 0.7305555555555556 | 34.234 |
| 0.7312500000000001 | 34.234 |
| 0.7319444444444444 | 43.079 |
| 0.7326388888888888 | 47.511 |
| 0.7333333333333334 | 60.85 |
| 0.7340277777777778 | 74.246 |
| 0.7347222222222222 | 78.722 |
| 0.7354166666666666 | 83.205 |
| 0.7361111111111112 | 78.722 |
| 0.7368055555555556 | 74.246 |
| 0.7374999999999999 | 65.31 |
| 0.7381944444444444 | 65.31 |
| 0.7388888888888889 | 65.31 |
| 0.7395833333333334 | 65.31 |
| 0.7402777777777777 | 69.775 |
| 0.7409722222222223 | 69.775 |
| 0.7416666666666667 | 74.246 |
| 0.7423611111111111 | 69.775 |
| 0.7430555555555555 | 69.775 |
| 0.74375 | 69.775 |
| 0.7444444444444445 | 69.775 |
| 0.7451388888888889 | 69.775 |
| 0.7458333333333332 | 65.31 |
| 0.7465277777777778 | 65.31 |
| 0.7472222222222222 | 65.31 |
| 0.7479166666666667 | 65.31 |
| 0.748611111111111 | 65.31 |
| 0.7493055555555556 | 69.775 |
| 0.75 | 74.246 |
| 0.7506944444444444 | 74.246 |
| 0.751388888888889 | 74.246 |
| 0.7520833333333333 | 69.775 |
| 0.7527777777777778 | 65.31 |
| 0.7534722222222222 | 60.85 |
| 0.7541666666666668 | 56.398 |
| 0.7548611111111111 | 51.951 |
| 0.7555555555555555 | 47.511 |
| 0.75625 | 47.511 |
| 0.7569444444444445 | 43.079 |
| 0.7576388888888889 | 43.079 |
| 0.7583333333333333 | 43.079 |
| 0.7590277777777777 | 38.653 |
| 0.7597222222222223 | 38.653 |
| 0.7604166666666666 | 38.653 |
| 0.7611111111111111 | 38.653 |
| 0.7618055555555556 | 34.234 |
| 0.7625000000000001 | 34.234 |
| 0.7631944444444444 | 34.234 |
| 0.7638888888888888 | 34.234 |
| 0.7645833333333334 | 29.823 |
| 0.7652777777777778 | 29.823 |
| 0.7659722222222222 | 29.823 |
| 0.7666666666666666 | 25.419 |
| 0.7673611111111112 | 25.419 |
| 0.7680555555555556 | 25.419 |
| 0.7687499999999999 | 21.024 |
| 0.7694444444444444 | 21.024 |
| 0.7701388888888889 | 21.024 |
| 0.7708333333333334 | 21.024 |
| 0.7715277777777777 | 21.024 |
| 0.7722222222222223 | 21.024 |
| 0.7729166666666667 | 21.024 |
| 0.7736111111111111 | 21.024 |
| 0.7743055555555555 | 21.024 |
| 0.775 | 21.024 |
| 0.7756944444444445 | 16.636 |
| 0.7763888888888889 | 16.636 |
| 0.7770833333333332 | 16.636 |
| 0.7777777777777778 | 12.257 |
| 0.7784722222222222 | 12.257 |
| 0.7791666666666667 | 12.257 |
| 0.779861111111111 | 12.257 |
| 0.7805555555555556 | 7.887 |
| 0.78125 | 7.887 |
| 0.7819444444444444 | 3.525 |
| 0.782638888888889 | 3.525 |
| 0.7833333333333333 | 3.525 |
| 0.7840277777777778 | 0 |
| 0.7847222222222222 | 0 |
| 0.7854166666666668 | 0 |
| 0.7861111111111111 | 0 |
| 0.7868055555555555 | 0 |
| 0.7875 | 0 |
| 0.7881944444444445 | 0 |
| 0.7888888888888889 | 0 |
| 0.7895833333333333 | 0 |
| 0.7902777777777777 | 0 |
| 0.7909722222222223 | 0 |
| 0.7916666666666666 | 0 |
| 0.7923611111111111 | 0 |
| 0.7930555555555556 | 0 |
| 0.7937500000000001 | 0 |
| 0.7944444444444444 | 0 |
| 0.7951388888888888 | 0 |
| 0.7958333333333334 | 0 |
| 0.7965277777777778 | 0 |
| 0.7972222222222222 | 0 |
| 0.7979166666666666 | 0 |
| 0.7986111111111112 | 0 |
| 0.7993055555555556 | 0 |
| 0.7999999999999999 | 0 |
| 0.8006944444444444 | 0 |
| 0.8013888888888889 | 0 |
| 0.8020833333333334 | 0 |
| 0.8027777777777777 | 0 |
| 0.8034722222222223 | 0 |
| 0.8041666666666667 | 0 |
| 0.8048611111111111 | 0 |
| 0.8055555555555555 | 0 |
| 0.80625 | 0 |
| 0.8069444444444445 | 0 |
| 0.8076388888888889 | 0 |
| 0.8083333333333332 | 0 |
| 0.8090277777777778 | 0 |
| 0.8097222222222222 | 0 |
| 0.8104166666666667 | 0 |
| 0.811111111111111 | 0 |
| 0.8118055555555556 | 0 |
| 0.8125 | 0 |
| 0.8131944444444444 | 0 |
| 0.813888888888889 | 0 |
| 0.8145833333333333 | 0 |
| 0.8152777777777778 | 0 |
| 0.8159722222222222 | 0 |
| 0.8166666666666668 | 0 |
| 0.8173611111111111 | 0 |
| 0.8180555555555555 | 0 |
| 0.81875 | 0 |
| 0.8194444444444445 | 0 |
| 0.8201388888888889 | 0 |
| 0.8208333333333333 | 0 |
| 0.8215277777777777 | 0 |
| 0.8222222222222223 | 0 |
| 0.8229166666666666 | 0 |
| 0.8236111111111111 | 0 |
| 0.8243055555555556 | 0 |
| 0.8250000000000001 | 0 |
| 0.8256944444444444 | 0 |
| 0.8263888888888888 | 0 |
| 0.8270833333333334 | 0 |
| 0.8277777777777778 | 0 |
| 0.8284722222222222 | 0 |
| 0.8291666666666666 | 0 |
| 0.8298611111111112 | 0 |
| 0.8305555555555556 | 0 |
| 0.8312499999999999 | 0 |
| 0.8319444444444444 | 0 |
| 0.8326388888888889 | 0 |
| 0.8333333333333334 | 0 |
| 0.8340277777777777 | 0 |
| 0.8347222222222223 | 0 |
| 0.8354166666666667 | 0 |
| 0.8361111111111111 | 0 |
| 0.8368055555555555 | 0 |
| 0.8375 | 0 |
| 0.8381944444444445 | 0 |
| 0.8388888888888889 | 0 |
| 0.8395833333333332 | 0 |
| 0.8402777777777778 | 0 |
| 0.8409722222222222 | 0 |
| 0.8416666666666667 | 0 |
| 0.842361111111111 | 0 |
| 0.8430555555555556 | 0 |
| 0.84375 | 0 |
| 0.8444444444444444 | 0 |
| 0.845138888888889 | 0 |
| 0.8458333333333333 | 0 |
| 0.8465277777777778 | 0 |
| 0.8472222222222222 | 0 |
| 0.8479166666666668 | 0 |
| 0.8486111111111111 | 0 |
| 0.8493055555555555 | 0 |
| 0.85 | 0 |
| 0.8506944444444445 | 0 |
| 0.8513888888888889 | 0 |
| 0.8520833333333333 | 0 |
| 0.8527777777777777 | 0 |
| 0.8534722222222223 | 0 |
| 0.8541666666666666 | 0 |
| 0.8548611111111111 | 0 |
| 0.8555555555555556 | 0 |
| 0.8562500000000001 | 0 |
| 0.8569444444444444 | 0 |
| 0.8576388888888888 | 0 |
| 0.8583333333333334 | 0 |
| 0.8590277777777778 | 0 |
| 0.8597222222222222 | 0 |
| 0.8604166666666666 | 0 |
| 0.8611111111111112 | 0 |
| 0.8618055555555556 | 0 |
| 0.8624999999999999 | 0 |
| 0.8631944444444444 | 0 |
| 0.8638888888888889 | 0 |
| 0.8645833333333334 | 0 |
| 0.8652777777777777 | 0 |
| 0.8659722222222223 | 0 |
| 0.8666666666666667 | 0 |
| 0.8673611111111111 | 0 |
| 0.8680555555555555 | 0 |
| 0.86875 | 0 |
| 0.8694444444444445 | 0 |
| 0.8701388888888889 | 0 |
| 0.8708333333333332 | 0 |
| 0.8715277777777778 | 0 |
| 0.8722222222222222 | 0 |
| 0.8729166666666667 | 0 |
| 0.873611111111111 | 0 |
| 0.8743055555555556 | 0 |
| 0.875 | 0 |
| 0.8756944444444444 | 0 |
| 0.876388888888889 | 0 |
| 0.8770833333333333 | 0 |
| 0.8777777777777778 | 0 |
| 0.8784722222222222 | 0 |
| 0.8791666666666668 | 0 |
| 0.8798611111111111 | 0 |
| 0.8805555555555555 | 0 |
| 0.88125 | 0 |
| 0.8819444444444445 | 0 |
| 0.8826388888888889 | 0 |
| 0.8833333333333333 | 0 |
| 0.8840277777777777 | 0 |
| 0.8847222222222223 | 0 |
| 0.8854166666666666 | 0 |
| 0.8861111111111111 | 0 |
| 0.8868055555555556 | 0 |
| 0.8875000000000001 | 0 |
| 0.8881944444444444 | 0 |
| 0.8888888888888888 | 0 |
| 0.8895833333333334 | 0 |
| 0.8902777777777778 | 0 |
| 0.8909722222222222 | 0 |
| 0.8916666666666666 | 0 |
| 0.8923611111111112 | 0 |
| 0.8930555555555556 | 0 |
| 0.8937499999999999 | 0 |
| 0.8944444444444444 | 0 |
| 0.8951388888888889 | 0 |
| 0.8958333333333334 | 0 |
| 0.8965277777777777 | 0 |
| 0.8972222222222223 | 0 |
| 0.8979166666666667 | 0 |
| 0.8986111111111111 | 0 |
| 0.8993055555555555 | 0 |
| 0.9 | 0 |
| 0.9006944444444445 | 0 |
| 0.9013888888888889 | 0 |
| 0.9020833333333332 | 0 |
| 0.9027777777777778 | 0 |
| 0.9034722222222222 | 0 |
| 0.9041666666666667 | 0 |
| 0.904861111111111 | 0 |
| 0.9055555555555556 | 0 |
| 0.90625 | 0 |
| 0.9069444444444444 | 0 |
| 0.907638888888889 | 0 |
| 0.9083333333333333 | 0 |
| 0.9090277777777778 | 0 |
| 0.9097222222222222 | 0 |
| 0.9104166666666668 | 0 |
| 0.9111111111111111 | 0 |
| 0.9118055555555555 | 0 |
| 0.9125 | 0 |
| 0.9131944444444445 | 0 |
| 0.9138888888888889 | 0 |
| 0.9145833333333333 | 0 |
| 0.9152777777777777 | 0 |
| 0.9159722222222223 | 0 |
| 0.9166666666666666 | 0 |
| 0.9173611111111111 | 0 |
| 0.9180555555555556 | 0 |
| 0.9187500000000001 | 0 |
| 0.9194444444444444 | 0 |
| 0.9201388888888888 | 0 |
| 0.9208333333333334 | 0 |
| 0.9215277777777778 | 0 |
| 0.9222222222222222 | 0 |
| 0.9229166666666666 | 0 |
| 0.9236111111111112 | 0 |
| 0.9243055555555556 | 0 |
| 0.9249999999999999 | 0 |
| 0.9256944444444444 | 0 |
| 0.9263888888888889 | 0 |
| 0.9270833333333334 | 0 |
| 0.9277777777777777 | 0 |
| 0.9284722222222223 | 0 |
| 0.9291666666666667 | 0 |
| 0.9298611111111111 | 0 |
| 0.9305555555555555 | 0 |
| 0.93125 | 0 |
| 0.9319444444444445 | 0 |
| 0.9326388888888889 | 0 |
| 0.9333333333333332 | 0 |
| 0.9340277777777778 | 0 |
| 0.9347222222222222 | 0 |
| 0.9354166666666667 | 0 |
| 0.936111111111111 | 0 |
| 0.9368055555555556 | 0 |
| 0.9375 | 0 |
| 0.9381944444444444 | 0 |
| 0.938888888888889 | 0 |
| 0.9395833333333333 | 0 |
| 0.9402777777777778 | 0 |
| 0.9409722222222222 | 0 |
| 0.9416666666666668 | 0 |
| 0.9423611111111111 | 0 |
| 0.9430555555555555 | 0 |
| 0.94375 | 0 |
| 0.9444444444444445 | 0 |
| 0.9451388888888889 | 0 |
| 0.9458333333333333 | 0 |
| 0.9465277777777777 | 0 |
| 0.9472222222222223 | 0 |
| 0.9479166666666666 | 0 |
| 0.9486111111111111 | 0 |
| 0.9493055555555556 | 0 |
| 0.9500000000000001 | 0 |
| 0.9506944444444444 | 0 |
| 0.9513888888888888 | 0 |
| 0.9520833333333334 | 0 |
| 0.9527777777777778 | 0 |
| 0.9534722222222222 | 0 |
| 0.9541666666666666 | 0 |
| 0.9548611111111112 | 0 |
| 0.9555555555555556 | 0 |
| 0.9562499999999999 | 0 |
| 0.9569444444444444 | 0 |
| 0.9576388888888889 | 0 |
| 0.9583333333333334 | 0 |
| 0.9590277777777777 | 0 |
| 0.9597222222222223 | 0 |
| 0.9604166666666667 | 0 |
| 0.9611111111111111 | 0 |
| 0.9618055555555555 | 0 |
| 0.9625 | 0 |
| 0.9631944444444445 | 0 |
| 0.9638888888888889 | 0 |
| 0.9645833333333332 | 0 |
| 0.9652777777777778 | 0 |
| 0.9659722222222222 | 0 |
| 0.9666666666666667 | 0 |
| 0.967361111111111 | 0 |
| 0.9680555555555556 | 0 |
| 0.96875 | 0 |
| 0.9694444444444444 | 0 |
| 0.970138888888889 | 0 |
| 0.9708333333333333 | 0 |
| 0.9715277777777778 | 0 |
| 0.9722222222222222 | 0 |
| 0.9729166666666668 | 0 |
| 0.9736111111111111 | 0 |
| 0.9743055555555555 | 0 |
| 0.975 | 0 |
| 0.9756944444444445 | 0 |
| 0.9763888888888889 | 0 |
| 0.9770833333333333 | 0 |
| 0.9777777777777777 | 0 |
| 0.9784722222222223 | 0 |
| 0.9791666666666666 | 0 |
| 0.9798611111111111 | 0 |
| 0.9805555555555556 | 0 |
| 0.9812500000000001 | 0 |
| 0.9819444444444444 | 0 |
| 0.9826388888888888 | 0 |
| 0.9833333333333334 | 0 |
| 0.9840277777777778 | 0 |
| 0.9847222222222222 | 0 |
| 0.9854166666666666 | 0 |
| 0.9861111111111112 | 0 |
| 0.9868055555555556 | 0 |
| 0.9874999999999999 | 0 |
| 0.9881944444444444 | 0 |
| 0.9888888888888889 | 0 |
| 0.9895833333333334 | 0 |
| 0.9902777777777777 | 0 |
| 0.9909722222222223 | 0 |
| 0.9916666666666667 | 0 |
| 0.9923611111111111 | 0 |
| 0.9930555555555555 | 0 |
| 0.99375 | 0 |
| 0.9944444444444445 | 0 |
| 0.9951388888888889 | 0 |
| 0.9958333333333332 | 0 |
| 0.9965277777777778 | 0 |
| 0.9972222222222222 | 0 |
| 0.9979166666666667 | 0 |
| 0.998611111111111 | 0 |
| 0.9993055555555556 | 0 |